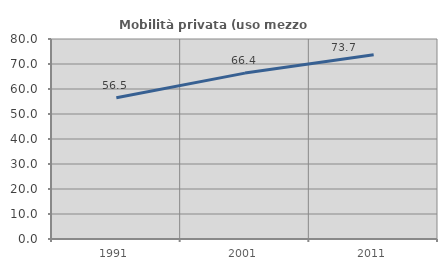
| Category | Mobilità privata (uso mezzo privato) |
|---|---|
| 1991.0 | 56.493 |
| 2001.0 | 66.358 |
| 2011.0 | 73.661 |